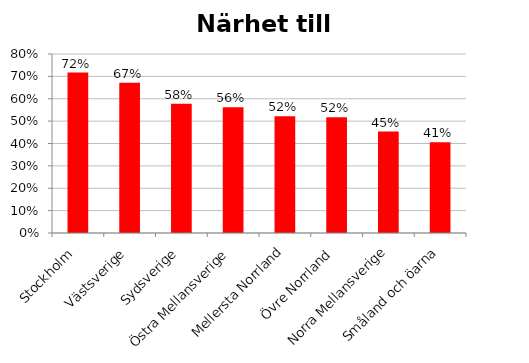
| Category | Närhet till kommunikationer |
|---|---|
| Stockholm | 0.717 |
| Västsverige | 0.672 |
| Sydsverige | 0.578 |
| Östra Mellansverige | 0.562 |
| Mellersta Norrland | 0.522 |
| Övre Norrland | 0.518 |
| Norra Mellansverige | 0.453 |
| Småland och öarna | 0.405 |